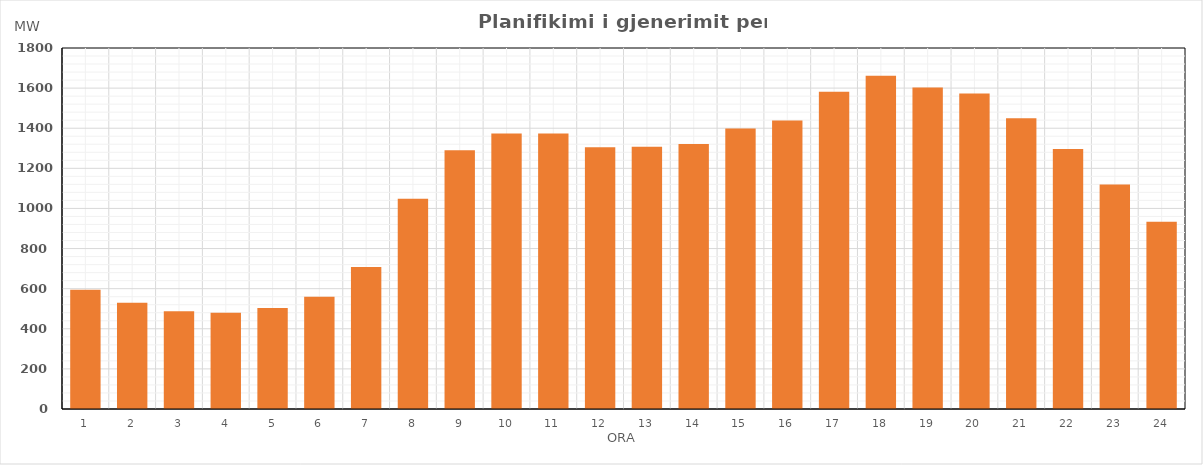
| Category | Max (MW) |
|---|---|
| 0 | 594.56 |
| 1 | 529.83 |
| 2 | 487.58 |
| 3 | 479.57 |
| 4 | 503.57 |
| 5 | 559.57 |
| 6 | 707.712 |
| 7 | 1048.456 |
| 8 | 1289.83 |
| 9 | 1373.527 |
| 10 | 1373.611 |
| 11 | 1305.611 |
| 12 | 1307.653 |
| 13 | 1320.888 |
| 14 | 1398.785 |
| 15 | 1438.737 |
| 16 | 1581.585 |
| 17 | 1661.35 |
| 18 | 1602.914 |
| 19 | 1572.782 |
| 20 | 1449.93 |
| 21 | 1296.14 |
| 22 | 1119.195 |
| 23 | 934.105 |